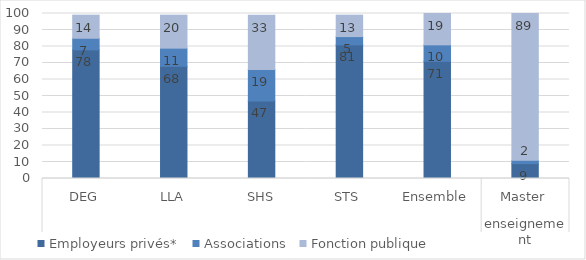
| Category | Employeurs privés* | Associations | Fonction publique |
|---|---|---|---|
| 0 | 78 | 7 | 14 |
| 1 | 68 | 11 | 20 |
| 2 | 47 | 19 | 33 |
| 3 | 81 | 5 | 13 |
| 4 | 71 | 10 | 19 |
| 5 | 9 | 2 | 89 |